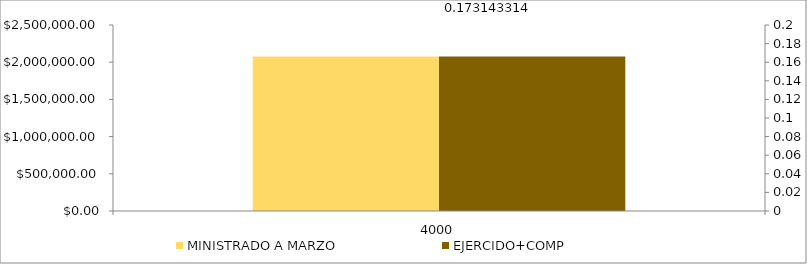
| Category | MINISTRADO A MARZO | EJERCIDO+COMP |
|---|---|---|
| 4000.0 | 2076972.9 | 2076972.9 |